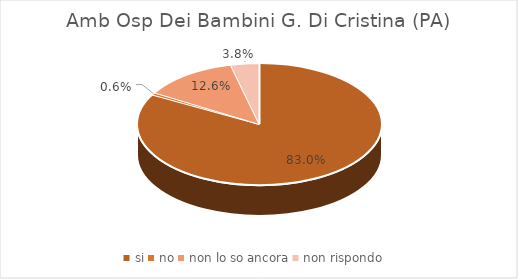
| Category | Amb Osp Dei Bambini G. Di Cristina (PA) |
|---|---|
| si | 0.83 |
| no | 0.006 |
| non lo so ancora | 0.126 |
| non rispondo | 0.038 |